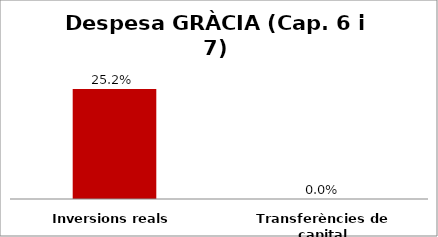
| Category | Series 0 |
|---|---|
| Inversions reals | 0.252 |
| Transferències de capital | 0 |